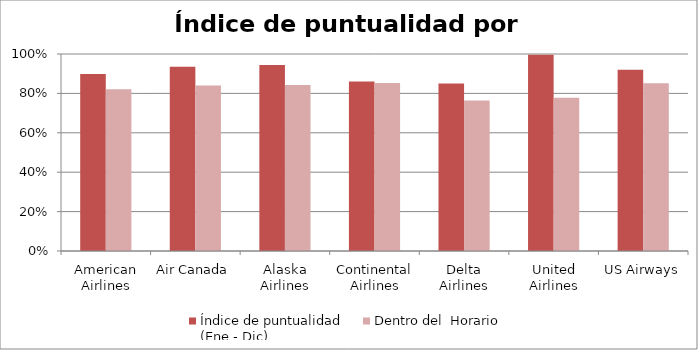
| Category | Índice de puntualidad
(Ene - Dic) | Dentro del  Horario |
|---|---|---|
| American Airlines | 0.899 | 0.821 |
| Air Canada | 0.935 | 0.84 |
| Alaska Airlines | 0.944 | 0.843 |
| Continental Airlines | 0.86 | 0.853 |
| Delta Airlines | 0.85 | 0.764 |
| United Airlines | 0.997 | 0.778 |
| US Airways | 0.92 | 0.851 |